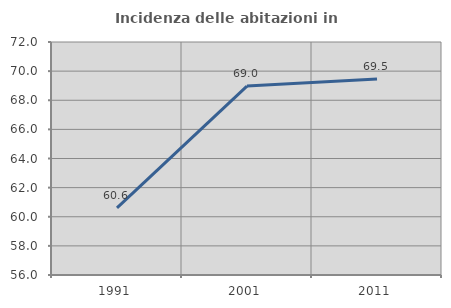
| Category | Incidenza delle abitazioni in proprietà  |
|---|---|
| 1991.0 | 60.606 |
| 2001.0 | 68.972 |
| 2011.0 | 69.461 |